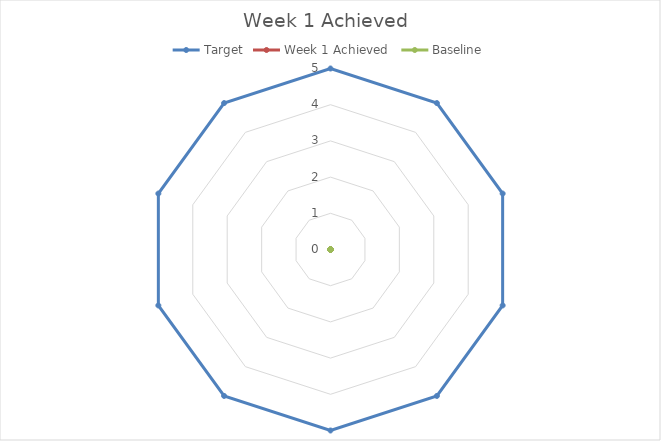
| Category | Target | Week 1 Achieved  | Baseline |
|---|---|---|---|
|  | 5 |  |  |
|  | 5 |  |  |
|  | 5 |  |  |
|  | 5 |  |  |
|  | 5 |  |  |
|  | 5 |  |  |
|  | 5 |  |  |
|  | 5 |  |  |
|  | 5 |  |  |
|  | 5 |  |  |